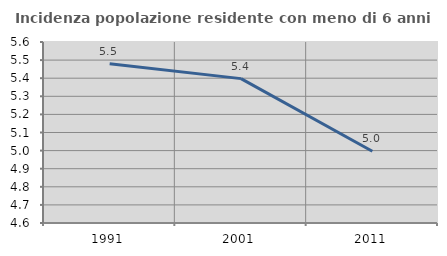
| Category | Incidenza popolazione residente con meno di 6 anni |
|---|---|
| 1991.0 | 5.48 |
| 2001.0 | 5.398 |
| 2011.0 | 4.997 |